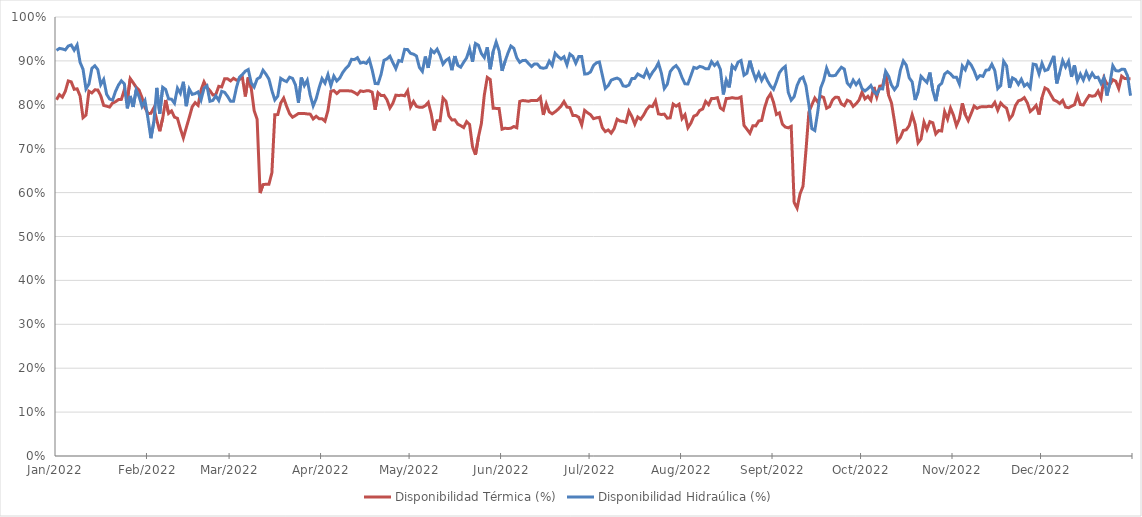
| Category | Disponibilidad Térmica (%) | Disponibilidad Hidraúlica (%) |
|---|---|---|
| 2022-01-01 | 0.811 | 0.924 |
| 2022-01-02 | 0.823 | 0.928 |
| 2022-01-03 | 0.818 | 0.927 |
| 2022-01-04 | 0.831 | 0.925 |
| 2022-01-05 | 0.854 | 0.934 |
| 2022-01-06 | 0.852 | 0.936 |
| 2022-01-07 | 0.835 | 0.924 |
| 2022-01-08 | 0.836 | 0.936 |
| 2022-01-09 | 0.82 | 0.897 |
| 2022-01-10 | 0.771 | 0.881 |
| 2022-01-11 | 0.777 | 0.836 |
| 2022-01-12 | 0.831 | 0.847 |
| 2022-01-13 | 0.827 | 0.883 |
| 2022-01-14 | 0.834 | 0.889 |
| 2022-01-15 | 0.834 | 0.88 |
| 2022-01-16 | 0.821 | 0.846 |
| 2022-01-17 | 0.799 | 0.858 |
| 2022-01-18 | 0.797 | 0.824 |
| 2022-01-19 | 0.795 | 0.813 |
| 2022-01-20 | 0.804 | 0.811 |
| 2022-01-21 | 0.807 | 0.83 |
| 2022-01-22 | 0.812 | 0.845 |
| 2022-01-23 | 0.812 | 0.855 |
| 2022-01-24 | 0.834 | 0.848 |
| 2022-01-25 | 0.81 | 0.792 |
| 2022-01-26 | 0.86 | 0.82 |
| 2022-01-27 | 0.85 | 0.795 |
| 2022-01-28 | 0.84 | 0.834 |
| 2022-01-29 | 0.833 | 0.819 |
| 2022-01-30 | 0.816 | 0.796 |
| 2022-01-31 | 0.793 | 0.809 |
| 2022-02-01 | 0.78 | 0.769 |
| 2022-02-02 | 0.781 | 0.724 |
| 2022-02-03 | 0.793 | 0.761 |
| 2022-02-04 | 0.765 | 0.839 |
| 2022-02-05 | 0.74 | 0.78 |
| 2022-02-06 | 0.769 | 0.84 |
| 2022-02-07 | 0.811 | 0.835 |
| 2022-02-08 | 0.78 | 0.814 |
| 2022-02-09 | 0.786 | 0.813 |
| 2022-02-10 | 0.772 | 0.804 |
| 2022-02-11 | 0.769 | 0.838 |
| 2022-02-12 | 0.745 | 0.826 |
| 2022-02-13 | 0.724 | 0.852 |
| 2022-02-14 | 0.748 | 0.797 |
| 2022-02-15 | 0.771 | 0.836 |
| 2022-02-16 | 0.795 | 0.824 |
| 2022-02-17 | 0.805 | 0.826 |
| 2022-02-18 | 0.799 | 0.829 |
| 2022-02-19 | 0.834 | 0.811 |
| 2022-02-20 | 0.852 | 0.838 |
| 2022-02-21 | 0.839 | 0.843 |
| 2022-02-22 | 0.832 | 0.808 |
| 2022-02-23 | 0.822 | 0.81 |
| 2022-02-24 | 0.823 | 0.82 |
| 2022-02-25 | 0.842 | 0.81 |
| 2022-02-26 | 0.841 | 0.831 |
| 2022-02-27 | 0.859 | 0.828 |
| 2022-02-28 | 0.859 | 0.819 |
| 2022-03-01 | 0.854 | 0.808 |
| 2022-03-02 | 0.86 | 0.808 |
| 2022-03-03 | 0.856 | 0.839 |
| 2022-03-04 | 0.858 | 0.863 |
| 2022-03-05 | 0.863 | 0.869 |
| 2022-03-06 | 0.819 | 0.877 |
| 2022-03-07 | 0.862 | 0.88 |
| 2022-03-08 | 0.838 | 0.85 |
| 2022-03-09 | 0.787 | 0.841 |
| 2022-03-10 | 0.767 | 0.859 |
| 2022-03-11 | 0.599 | 0.863 |
| 2022-03-12 | 0.618 | 0.879 |
| 2022-03-13 | 0.619 | 0.87 |
| 2022-03-14 | 0.619 | 0.859 |
| 2022-03-15 | 0.645 | 0.832 |
| 2022-03-16 | 0.777 | 0.811 |
| 2022-03-17 | 0.778 | 0.82 |
| 2022-03-18 | 0.804 | 0.86 |
| 2022-03-19 | 0.815 | 0.856 |
| 2022-03-20 | 0.796 | 0.853 |
| 2022-03-21 | 0.78 | 0.863 |
| 2022-03-22 | 0.772 | 0.86 |
| 2022-03-23 | 0.776 | 0.845 |
| 2022-03-24 | 0.78 | 0.805 |
| 2022-03-25 | 0.78 | 0.862 |
| 2022-03-26 | 0.78 | 0.844 |
| 2022-03-27 | 0.779 | 0.856 |
| 2022-03-28 | 0.779 | 0.822 |
| 2022-03-29 | 0.768 | 0.797 |
| 2022-03-30 | 0.774 | 0.813 |
| 2022-03-31 | 0.768 | 0.839 |
| 2022-04-01 | 0.768 | 0.86 |
| 2022-04-02 | 0.763 | 0.849 |
| 2022-04-03 | 0.787 | 0.869 |
| 2022-04-04 | 0.831 | 0.844 |
| 2022-04-05 | 0.833 | 0.865 |
| 2022-04-06 | 0.826 | 0.854 |
| 2022-04-07 | 0.832 | 0.861 |
| 2022-04-08 | 0.832 | 0.873 |
| 2022-04-09 | 0.832 | 0.882 |
| 2022-04-10 | 0.832 | 0.889 |
| 2022-04-11 | 0.831 | 0.904 |
| 2022-04-12 | 0.828 | 0.903 |
| 2022-04-13 | 0.824 | 0.907 |
| 2022-04-14 | 0.832 | 0.895 |
| 2022-04-15 | 0.83 | 0.897 |
| 2022-04-16 | 0.832 | 0.894 |
| 2022-04-17 | 0.832 | 0.904 |
| 2022-04-18 | 0.829 | 0.879 |
| 2022-04-19 | 0.789 | 0.849 |
| 2022-04-20 | 0.827 | 0.848 |
| 2022-04-21 | 0.821 | 0.869 |
| 2022-04-22 | 0.821 | 0.901 |
| 2022-04-23 | 0.812 | 0.905 |
| 2022-04-24 | 0.793 | 0.911 |
| 2022-04-25 | 0.803 | 0.896 |
| 2022-04-26 | 0.822 | 0.882 |
| 2022-04-27 | 0.821 | 0.901 |
| 2022-04-28 | 0.822 | 0.899 |
| 2022-04-29 | 0.82 | 0.926 |
| 2022-04-30 | 0.832 | 0.926 |
| 2022-05-01 | 0.795 | 0.917 |
| 2022-05-02 | 0.808 | 0.915 |
| 2022-05-03 | 0.796 | 0.911 |
| 2022-05-04 | 0.794 | 0.885 |
| 2022-05-05 | 0.794 | 0.876 |
| 2022-05-06 | 0.798 | 0.91 |
| 2022-05-07 | 0.805 | 0.884 |
| 2022-05-08 | 0.78 | 0.925 |
| 2022-05-09 | 0.742 | 0.918 |
| 2022-05-10 | 0.764 | 0.927 |
| 2022-05-11 | 0.764 | 0.912 |
| 2022-05-12 | 0.815 | 0.893 |
| 2022-05-13 | 0.808 | 0.901 |
| 2022-05-14 | 0.775 | 0.906 |
| 2022-05-15 | 0.766 | 0.879 |
| 2022-05-16 | 0.766 | 0.911 |
| 2022-05-17 | 0.756 | 0.89 |
| 2022-05-18 | 0.752 | 0.886 |
| 2022-05-19 | 0.748 | 0.897 |
| 2022-05-20 | 0.762 | 0.907 |
| 2022-05-21 | 0.755 | 0.928 |
| 2022-05-22 | 0.704 | 0.898 |
| 2022-05-23 | 0.686 | 0.94 |
| 2022-05-24 | 0.726 | 0.936 |
| 2022-05-25 | 0.757 | 0.917 |
| 2022-05-26 | 0.823 | 0.908 |
| 2022-05-27 | 0.862 | 0.931 |
| 2022-05-28 | 0.858 | 0.881 |
| 2022-05-29 | 0.792 | 0.921 |
| 2022-05-30 | 0.792 | 0.943 |
| 2022-05-31 | 0.792 | 0.923 |
| 2022-06-01 | 0.744 | 0.877 |
| 2022-06-02 | 0.747 | 0.898 |
| 2022-06-03 | 0.746 | 0.918 |
| 2022-06-04 | 0.747 | 0.934 |
| 2022-06-05 | 0.751 | 0.929 |
| 2022-06-06 | 0.748 | 0.907 |
| 2022-06-07 | 0.808 | 0.897 |
| 2022-06-08 | 0.81 | 0.901 |
| 2022-06-09 | 0.809 | 0.901 |
| 2022-06-10 | 0.808 | 0.894 |
| 2022-06-11 | 0.81 | 0.887 |
| 2022-06-12 | 0.81 | 0.893 |
| 2022-06-13 | 0.81 | 0.893 |
| 2022-06-14 | 0.817 | 0.885 |
| 2022-06-15 | 0.777 | 0.883 |
| 2022-06-16 | 0.802 | 0.885 |
| 2022-06-17 | 0.784 | 0.899 |
| 2022-06-18 | 0.779 | 0.89 |
| 2022-06-19 | 0.784 | 0.917 |
| 2022-06-20 | 0.79 | 0.91 |
| 2022-06-21 | 0.797 | 0.904 |
| 2022-06-22 | 0.807 | 0.909 |
| 2022-06-23 | 0.795 | 0.891 |
| 2022-06-24 | 0.794 | 0.916 |
| 2022-06-25 | 0.776 | 0.91 |
| 2022-06-26 | 0.776 | 0.895 |
| 2022-06-27 | 0.772 | 0.91 |
| 2022-06-28 | 0.754 | 0.91 |
| 2022-06-29 | 0.787 | 0.87 |
| 2022-06-30 | 0.782 | 0.871 |
| 2022-07-01 | 0.777 | 0.875 |
| 2022-07-02 | 0.768 | 0.889 |
| 2022-07-03 | 0.77 | 0.896 |
| 2022-07-04 | 0.771 | 0.898 |
| 2022-07-05 | 0.748 | 0.867 |
| 2022-07-06 | 0.739 | 0.837 |
| 2022-07-07 | 0.743 | 0.844 |
| 2022-07-08 | 0.735 | 0.856 |
| 2022-07-09 | 0.746 | 0.859 |
| 2022-07-10 | 0.767 | 0.861 |
| 2022-07-11 | 0.763 | 0.857 |
| 2022-07-12 | 0.762 | 0.843 |
| 2022-07-13 | 0.76 | 0.842 |
| 2022-07-14 | 0.786 | 0.845 |
| 2022-07-15 | 0.773 | 0.86 |
| 2022-07-16 | 0.756 | 0.86 |
| 2022-07-17 | 0.772 | 0.87 |
| 2022-07-18 | 0.767 | 0.866 |
| 2022-07-19 | 0.777 | 0.863 |
| 2022-07-20 | 0.789 | 0.878 |
| 2022-07-21 | 0.797 | 0.863 |
| 2022-07-22 | 0.796 | 0.874 |
| 2022-07-23 | 0.809 | 0.883 |
| 2022-07-24 | 0.779 | 0.895 |
| 2022-07-25 | 0.778 | 0.872 |
| 2022-07-26 | 0.779 | 0.837 |
| 2022-07-27 | 0.77 | 0.847 |
| 2022-07-28 | 0.77 | 0.876 |
| 2022-07-29 | 0.802 | 0.884 |
| 2022-07-30 | 0.797 | 0.889 |
| 2022-07-31 | 0.801 | 0.88 |
| 2022-08-01 | 0.769 | 0.862 |
| 2022-08-02 | 0.777 | 0.848 |
| 2022-08-03 | 0.748 | 0.847 |
| 2022-08-04 | 0.758 | 0.866 |
| 2022-08-05 | 0.774 | 0.885 |
| 2022-08-06 | 0.777 | 0.883 |
| 2022-08-07 | 0.787 | 0.887 |
| 2022-08-08 | 0.79 | 0.886 |
| 2022-08-09 | 0.808 | 0.882 |
| 2022-08-10 | 0.8 | 0.882 |
| 2022-08-11 | 0.814 | 0.898 |
| 2022-08-12 | 0.814 | 0.89 |
| 2022-08-13 | 0.816 | 0.896 |
| 2022-08-14 | 0.793 | 0.881 |
| 2022-08-15 | 0.788 | 0.824 |
| 2022-08-16 | 0.814 | 0.856 |
| 2022-08-17 | 0.815 | 0.84 |
| 2022-08-18 | 0.816 | 0.889 |
| 2022-08-19 | 0.815 | 0.882 |
| 2022-08-20 | 0.815 | 0.897 |
| 2022-08-21 | 0.818 | 0.901 |
| 2022-08-22 | 0.753 | 0.867 |
| 2022-08-23 | 0.744 | 0.872 |
| 2022-08-24 | 0.735 | 0.901 |
| 2022-08-25 | 0.752 | 0.876 |
| 2022-08-26 | 0.752 | 0.858 |
| 2022-08-27 | 0.763 | 0.873 |
| 2022-08-28 | 0.764 | 0.856 |
| 2022-08-29 | 0.794 | 0.869 |
| 2022-08-30 | 0.815 | 0.854 |
| 2022-08-31 | 0.825 | 0.843 |
| 2022-09-01 | 0.806 | 0.835 |
| 2022-09-02 | 0.778 | 0.853 |
| 2022-09-03 | 0.782 | 0.873 |
| 2022-09-04 | 0.756 | 0.882 |
| 2022-09-05 | 0.749 | 0.887 |
| 2022-09-06 | 0.747 | 0.828 |
| 2022-09-07 | 0.751 | 0.811 |
| 2022-09-08 | 0.578 | 0.819 |
| 2022-09-09 | 0.565 | 0.844 |
| 2022-09-10 | 0.597 | 0.859 |
| 2022-09-11 | 0.614 | 0.863 |
| 2022-09-12 | 0.696 | 0.843 |
| 2022-09-13 | 0.784 | 0.8 |
| 2022-09-14 | 0.8 | 0.746 |
| 2022-09-15 | 0.815 | 0.741 |
| 2022-09-16 | 0.806 | 0.784 |
| 2022-09-17 | 0.819 | 0.838 |
| 2022-09-18 | 0.817 | 0.856 |
| 2022-09-19 | 0.792 | 0.883 |
| 2022-09-20 | 0.796 | 0.867 |
| 2022-09-21 | 0.811 | 0.866 |
| 2022-09-22 | 0.817 | 0.867 |
| 2022-09-23 | 0.817 | 0.877 |
| 2022-09-24 | 0.802 | 0.886 |
| 2022-09-25 | 0.798 | 0.881 |
| 2022-09-26 | 0.81 | 0.85 |
| 2022-09-27 | 0.807 | 0.842 |
| 2022-09-28 | 0.796 | 0.856 |
| 2022-09-29 | 0.802 | 0.846 |
| 2022-09-30 | 0.811 | 0.855 |
| 2022-10-01 | 0.829 | 0.837 |
| 2022-10-02 | 0.813 | 0.832 |
| 2022-10-03 | 0.819 | 0.837 |
| 2022-10-04 | 0.81 | 0.844 |
| 2022-10-05 | 0.841 | 0.83 |
| 2022-10-06 | 0.818 | 0.824 |
| 2022-10-07 | 0.842 | 0.837 |
| 2022-10-08 | 0.843 | 0.836 |
| 2022-10-09 | 0.874 | 0.876 |
| 2022-10-10 | 0.822 | 0.865 |
| 2022-10-11 | 0.804 | 0.845 |
| 2022-10-12 | 0.762 | 0.834 |
| 2022-10-13 | 0.717 | 0.844 |
| 2022-10-14 | 0.726 | 0.879 |
| 2022-10-15 | 0.742 | 0.9 |
| 2022-10-16 | 0.743 | 0.89 |
| 2022-10-17 | 0.753 | 0.862 |
| 2022-10-18 | 0.777 | 0.852 |
| 2022-10-19 | 0.756 | 0.811 |
| 2022-10-20 | 0.713 | 0.829 |
| 2022-10-21 | 0.722 | 0.865 |
| 2022-10-22 | 0.761 | 0.858 |
| 2022-10-23 | 0.744 | 0.851 |
| 2022-10-24 | 0.762 | 0.873 |
| 2022-10-25 | 0.759 | 0.833 |
| 2022-10-26 | 0.734 | 0.808 |
| 2022-10-27 | 0.741 | 0.843 |
| 2022-10-28 | 0.74 | 0.849 |
| 2022-10-29 | 0.784 | 0.87 |
| 2022-10-30 | 0.767 | 0.876 |
| 2022-10-31 | 0.793 | 0.871 |
| 2022-11-01 | 0.776 | 0.863 |
| 2022-11-02 | 0.753 | 0.863 |
| 2022-11-03 | 0.768 | 0.847 |
| 2022-11-04 | 0.803 | 0.889 |
| 2022-11-05 | 0.778 | 0.88 |
| 2022-11-06 | 0.764 | 0.898 |
| 2022-11-07 | 0.78 | 0.891 |
| 2022-11-08 | 0.797 | 0.877 |
| 2022-11-09 | 0.792 | 0.86 |
| 2022-11-10 | 0.795 | 0.867 |
| 2022-11-11 | 0.796 | 0.865 |
| 2022-11-12 | 0.795 | 0.879 |
| 2022-11-13 | 0.797 | 0.88 |
| 2022-11-14 | 0.796 | 0.892 |
| 2022-11-15 | 0.806 | 0.878 |
| 2022-11-16 | 0.788 | 0.837 |
| 2022-11-17 | 0.804 | 0.844 |
| 2022-11-18 | 0.797 | 0.899 |
| 2022-11-19 | 0.792 | 0.889 |
| 2022-11-20 | 0.768 | 0.838 |
| 2022-11-21 | 0.776 | 0.861 |
| 2022-11-22 | 0.798 | 0.858 |
| 2022-11-23 | 0.809 | 0.847 |
| 2022-11-24 | 0.811 | 0.858 |
| 2022-11-25 | 0.816 | 0.843 |
| 2022-11-26 | 0.805 | 0.848 |
| 2022-11-27 | 0.785 | 0.839 |
| 2022-11-28 | 0.791 | 0.893 |
| 2022-11-29 | 0.799 | 0.891 |
| 2022-11-30 | 0.778 | 0.87 |
| 2022-12-01 | 0.816 | 0.895 |
| 2022-12-02 | 0.838 | 0.878 |
| 2022-12-03 | 0.835 | 0.88 |
| 2022-12-04 | 0.823 | 0.896 |
| 2022-12-05 | 0.811 | 0.911 |
| 2022-12-06 | 0.808 | 0.849 |
| 2022-12-07 | 0.803 | 0.873 |
| 2022-12-08 | 0.81 | 0.901 |
| 2022-12-09 | 0.795 | 0.886 |
| 2022-12-10 | 0.793 | 0.899 |
| 2022-12-11 | 0.797 | 0.864 |
| 2022-12-12 | 0.8 | 0.89 |
| 2022-12-13 | 0.821 | 0.855 |
| 2022-12-14 | 0.801 | 0.87 |
| 2022-12-15 | 0.8 | 0.856 |
| 2022-12-16 | 0.811 | 0.874 |
| 2022-12-17 | 0.821 | 0.859 |
| 2022-12-18 | 0.82 | 0.872 |
| 2022-12-19 | 0.821 | 0.862 |
| 2022-12-20 | 0.831 | 0.863 |
| 2022-12-21 | 0.815 | 0.848 |
| 2022-12-22 | 0.861 | 0.861 |
| 2022-12-23 | 0.848 | 0.821 |
| 2022-12-24 | 0.846 | 0.848 |
| 2022-12-25 | 0.857 | 0.889 |
| 2022-12-26 | 0.854 | 0.878 |
| 2022-12-27 | 0.837 | 0.877 |
| 2022-12-28 | 0.865 | 0.881 |
| 2022-12-29 | 0.86 | 0.881 |
| 2022-12-30 | 0.859 | 0.866 |
| 2022-12-31 | 0.859 | 0.821 |